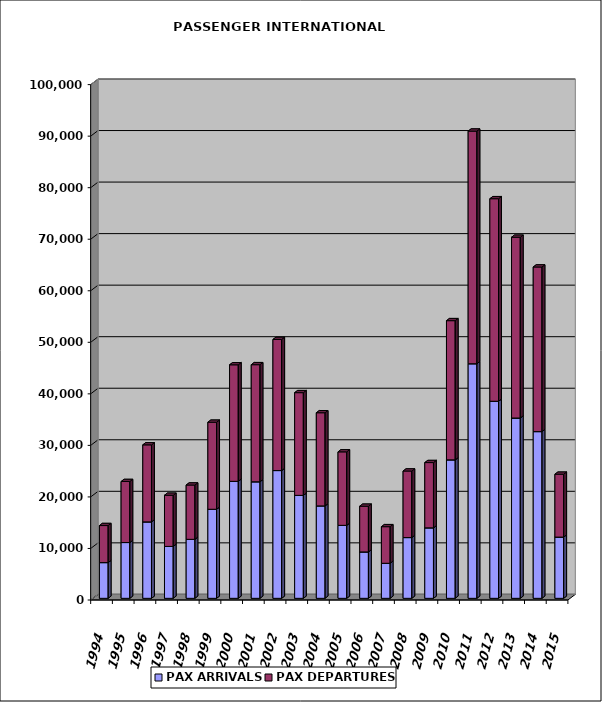
| Category | PAX ARRIVALS | PAX DEPARTURES |
|---|---|---|
| 1994.0 | 6929 | 7189 |
| 1995.0 | 10823 | 11843 |
| 1996.0 | 14831 | 14946 |
| 1997.0 | 10071 | 9926 |
| 1998.0 | 11447 | 10534 |
| 1999.0 | 17279 | 16887 |
| 2000.0 | 22700 | 22608 |
| 2001.0 | 22610 | 22720 |
| 2002.0 | 24790 | 25439 |
| 2003.0 | 19974 | 19930 |
| 2004.0 | 17936 | 18070 |
| 2005.0 | 14161 | 14258 |
| 2006.0 | 9000 | 8869 |
| 2007.0 | 6800 | 7098 |
| 2008.0 | 11787 | 12913 |
| 2009.0 | 13675 | 12665 |
| 2010.0 | 26867 | 27007 |
| 2011.0 | 45514 | 45140 |
| 2012.0 | 38238 | 39298 |
| 2013.0 | 34986 | 35075 |
| 2014.0 | 32346 | 31940 |
| 2015.0 | 11881 | 12198 |